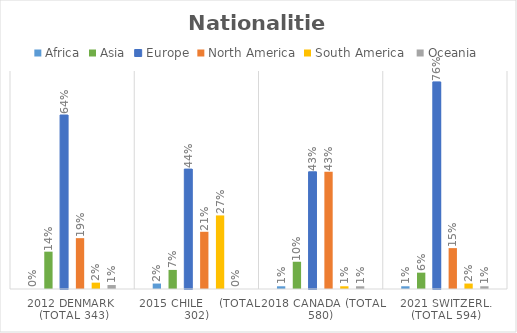
| Category | Africa | Asia | Europe | North America | South America  | Oceania |
|---|---|---|---|---|---|---|
| 2012 Denmark   (total 343) | 0 | 0.137 | 0.638 | 0.187 | 0.023 | 0.015 |
| 2015 Chile    (Total 302) | 0.02 | 0.07 | 0.44 | 0.21 | 0.27 | 0 |
| 2018 Canada (Total 580) | 0.01 | 0.1 | 0.43 | 0.43 | 0.01 | 0.01 |
| 2021 Switzerl. (Total 594) | 0.01 | 0.06 | 0.76 | 0.15 | 0.02 | 0.01 |